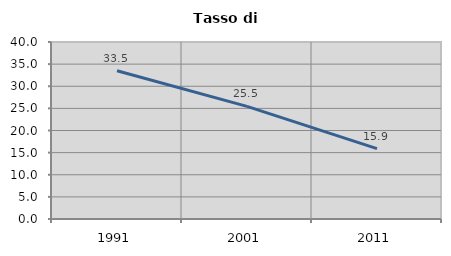
| Category | Tasso di disoccupazione   |
|---|---|
| 1991.0 | 33.49 |
| 2001.0 | 25.461 |
| 2011.0 | 15.909 |